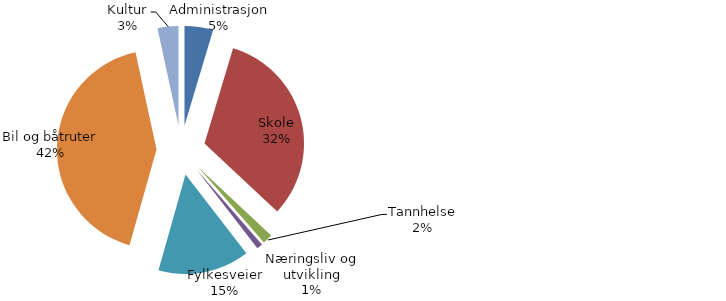
| Category | Series 0 |
|---|---|
| Administrasjon | 3451.972 |
| Skole | 24076.949 |
| Tannhelse | 1210.107 |
| Næringsliv og utvikling | 706.128 |
| Fylkesveier | 11060.678 |
| Bil og båtruter | 31465.884 |
| Kultur | 2521.107 |